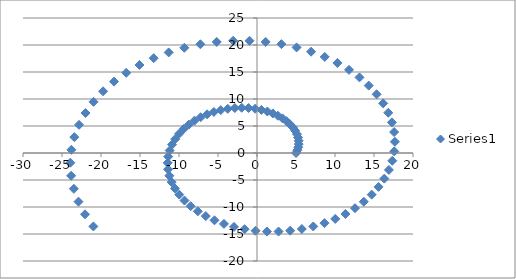
| Category | Series 0 |
|---|---|
| 5.0 | 0 |
| 5.174021659445734 | 0.519 |
| 5.292359520342705 | 1.073 |
| 5.349884339103393 | 1.655 |
| 5.342153765216733 | 2.259 |
| 5.2654953713422366 | 2.877 |
| 5.117080812440005 | 3.501 |
| 4.894989998620726 | 4.123 |
| 4.598264281691291 | 4.735 |
| 4.226947784240518 | 5.327 |
| 3.7821161410769784 | 5.89 |
| 3.2658920742641566 | 6.417 |
| 2.681447383127383 | 6.897 |
| 2.032991097546864 | 7.323 |
| 1.3257437146218785 | 7.687 |
| 0.5658976133416233 | 7.98 |
| -0.23943608287056828 | 8.197 |
| -1.082293752082409 | 8.33 |
| -1.9539380143605491 | 8.375 |
| -2.8449481883988317 | 8.327 |
| -3.745321528924282 | 8.184 |
| -4.644584162318689 | 7.942 |
| -5.531910502200251 | 7.6 |
| -6.396249804286316 | 7.159 |
| -7.2264584123042095 | 6.62 |
| -8.011436155469337 | 5.985 |
| -8.740265284363263 | 5.258 |
| -9.402350276977437 | 4.445 |
| -9.98755681108778 | 3.551 |
| -10.48634818361558 | 2.584 |
| -10.889917462604899 | 1.552 |
| -11.19031368306073 | 0.466 |
| -11.380560444060185 | -0.665 |
| -11.454765330942834 | -1.83 |
| -11.40821867243764 | -3.015 |
| -11.237480247489556 | -4.209 |
| -10.940452679276593 | -5.399 |
| -10.51644039320906 | -6.57 |
| -9.966193170121649 | -7.709 |
| -9.29193349376179 | -8.803 |
| -8.497367071226956 | -9.838 |
| -7.587676094239145 | -10.801 |
| -6.569495005965372 | -11.679 |
| -5.450868740287666 | -12.46 |
| -4.241193605702187 | -13.132 |
| -2.951141192030916 | -13.685 |
| -1.5925658824777666 | -14.11 |
| -0.17839675386562406 | -14.399 |
| 1.2774851582159303 | -14.544 |
| 2.7603830674541214 | -14.54 |
| 4.254932781948393 | -14.384 |
| 5.745261689237313 | -14.072 |
| 7.215156738025808 | -13.605 |
| 8.648239644394922 | -12.983 |
| 10.028147439893628 | -12.21 |
| 11.33871638866016 | -11.289 |
| 12.564167231866055 | -10.227 |
| 13.68928967136222 | -9.031 |
| 14.699623981225903 | -7.712 |
| 15.581637636499805 | -6.281 |
| 16.32289487305622 | -4.75 |
| 16.91221714121246 | -3.133 |
| 17.33983248820398 | -1.446 |
| 17.597512000348107 | 0.296 |
| 17.678691553895828 | 2.075 |
| 17.57857726310442 | 3.872 |
| 17.294233173645235 | 5.67 |
| 16.824649927529876 | 7.449 |
| 16.170793320506743 | 9.191 |
| 15.335631882356708 | 10.875 |
| 14.324142832522787 | 12.483 |
| 13.143295995701875 | 13.996 |
| 11.802015501925737 | 15.397 |
| 10.31111934066965 | 16.669 |
| 8.68323708597293 | 17.794 |
| 6.932706356700517 | 18.76 |
| 5.075448820161549 | 19.552 |
| 3.1288267855724325 | 20.159 |
| 1.1114816635905667 | 20.57 |
| -0.9568442133023686 | 20.778 |
| -3.055500709980884 | 20.777 |
| -5.163136059198771 | 20.562 |
| -7.257914025054096 | 20.132 |
| -9.31773985136541 | 19.487 |
| -11.320492659743746 | 18.63 |
| -13.24426185906612 | 17.567 |
| -15.067585050504276 | 16.304 |
| -16.76968486138176 | 14.851 |
| -18.33070211779343 | 13.219 |
| -19.73192277069736 | 11.423 |
| -20.95599602334757 | 9.479 |
| -21.987141169441795 | 7.403 |
| -22.81134074085744 | 5.216 |
| -23.416517680681444 | 2.937 |
| -23.792694400437917 | 0.59 |
| -23.932131748713083 | -1.804 |
| -23.82944611021787 | -4.219 |
| -23.48170306788396 | -6.631 |
| -22.888486293776932 | -9.015 |
| -22.05194058510895 | -11.347 |
| -20.97678822691131 | -13.601 |